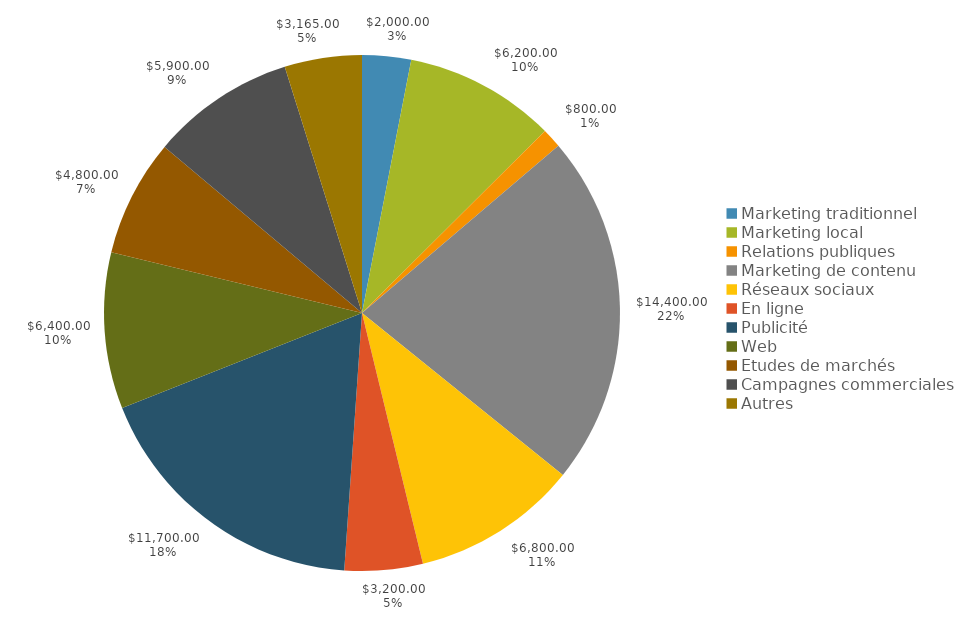
| Category | Series 0 | Series 1 |
|---|---|---|
| Marketing traditionnel | 2000 | 0.031 |
| Marketing local | 6200 | 0.095 |
| Relations publiques | 800 | 0.012 |
| Marketing de contenu | 14400 | 0.22 |
| Réseaux sociaux | 6800 | 0.104 |
| En ligne | 3200 | 0.049 |
| Publicité | 11700 | 0.179 |
| Web | 6400 | 0.098 |
| Etudes de marchés | 4800 | 0.073 |
| Campagnes commerciales | 5900 | 0.09 |
| Autres | 3165 | 0.048 |